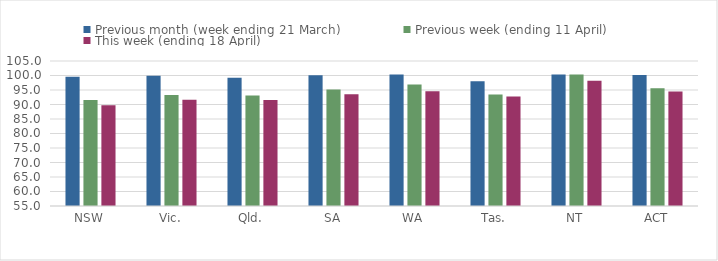
| Category | Previous month (week ending 21 March) | Previous week (ending 11 April) | This week (ending 18 April) |
|---|---|---|---|
| NSW | 99.568 | 91.584 | 89.78 |
| Vic. | 99.877 | 93.292 | 91.612 |
| Qld. | 99.245 | 93.093 | 91.509 |
| SA | 100.054 | 95.211 | 93.507 |
| WA | 100.342 | 96.918 | 94.528 |
| Tas. | 97.995 | 93.424 | 92.794 |
| NT | 100.342 | 100.384 | 98.182 |
| ACT | 100.191 | 95.642 | 94.469 |